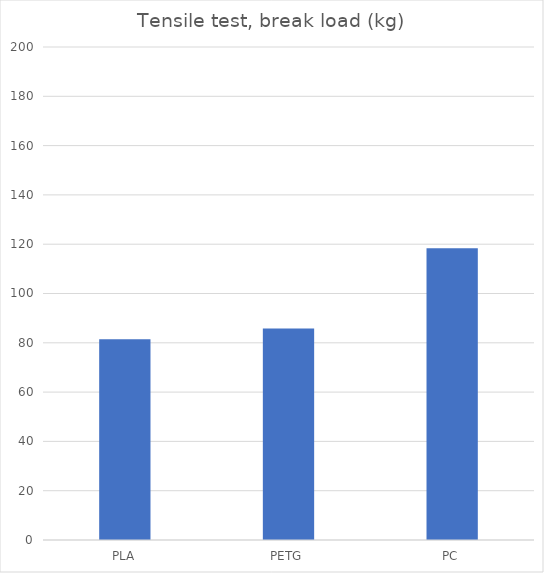
| Category | Average (kg) |
|---|---|
| PLA | 81.4 |
| PETG | 85.8 |
| PC | 118.4 |